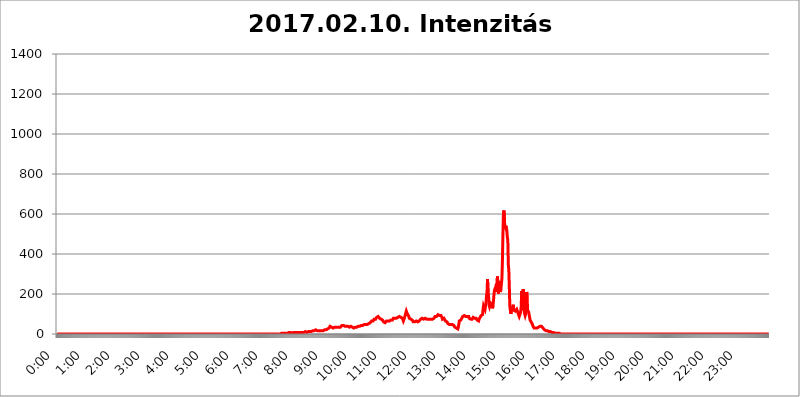
| Category | 2017.02.10. Intenzitás [W/m^2] |
|---|---|
| 0.0 | 0 |
| 0.0006944444444444445 | 0 |
| 0.001388888888888889 | 0 |
| 0.0020833333333333333 | 0 |
| 0.002777777777777778 | 0 |
| 0.003472222222222222 | 0 |
| 0.004166666666666667 | 0 |
| 0.004861111111111111 | 0 |
| 0.005555555555555556 | 0 |
| 0.0062499999999999995 | 0 |
| 0.006944444444444444 | 0 |
| 0.007638888888888889 | 0 |
| 0.008333333333333333 | 0 |
| 0.009027777777777779 | 0 |
| 0.009722222222222222 | 0 |
| 0.010416666666666666 | 0 |
| 0.011111111111111112 | 0 |
| 0.011805555555555555 | 0 |
| 0.012499999999999999 | 0 |
| 0.013194444444444444 | 0 |
| 0.013888888888888888 | 0 |
| 0.014583333333333332 | 0 |
| 0.015277777777777777 | 0 |
| 0.015972222222222224 | 0 |
| 0.016666666666666666 | 0 |
| 0.017361111111111112 | 0 |
| 0.018055555555555557 | 0 |
| 0.01875 | 0 |
| 0.019444444444444445 | 0 |
| 0.02013888888888889 | 0 |
| 0.020833333333333332 | 0 |
| 0.02152777777777778 | 0 |
| 0.022222222222222223 | 0 |
| 0.02291666666666667 | 0 |
| 0.02361111111111111 | 0 |
| 0.024305555555555556 | 0 |
| 0.024999999999999998 | 0 |
| 0.025694444444444447 | 0 |
| 0.02638888888888889 | 0 |
| 0.027083333333333334 | 0 |
| 0.027777777777777776 | 0 |
| 0.02847222222222222 | 0 |
| 0.029166666666666664 | 0 |
| 0.029861111111111113 | 0 |
| 0.030555555555555555 | 0 |
| 0.03125 | 0 |
| 0.03194444444444445 | 0 |
| 0.03263888888888889 | 0 |
| 0.03333333333333333 | 0 |
| 0.034027777777777775 | 0 |
| 0.034722222222222224 | 0 |
| 0.035416666666666666 | 0 |
| 0.036111111111111115 | 0 |
| 0.03680555555555556 | 0 |
| 0.0375 | 0 |
| 0.03819444444444444 | 0 |
| 0.03888888888888889 | 0 |
| 0.03958333333333333 | 0 |
| 0.04027777777777778 | 0 |
| 0.04097222222222222 | 0 |
| 0.041666666666666664 | 0 |
| 0.042361111111111106 | 0 |
| 0.04305555555555556 | 0 |
| 0.043750000000000004 | 0 |
| 0.044444444444444446 | 0 |
| 0.04513888888888889 | 0 |
| 0.04583333333333334 | 0 |
| 0.04652777777777778 | 0 |
| 0.04722222222222222 | 0 |
| 0.04791666666666666 | 0 |
| 0.04861111111111111 | 0 |
| 0.049305555555555554 | 0 |
| 0.049999999999999996 | 0 |
| 0.05069444444444445 | 0 |
| 0.051388888888888894 | 0 |
| 0.052083333333333336 | 0 |
| 0.05277777777777778 | 0 |
| 0.05347222222222222 | 0 |
| 0.05416666666666667 | 0 |
| 0.05486111111111111 | 0 |
| 0.05555555555555555 | 0 |
| 0.05625 | 0 |
| 0.05694444444444444 | 0 |
| 0.057638888888888885 | 0 |
| 0.05833333333333333 | 0 |
| 0.05902777777777778 | 0 |
| 0.059722222222222225 | 0 |
| 0.06041666666666667 | 0 |
| 0.061111111111111116 | 0 |
| 0.06180555555555556 | 0 |
| 0.0625 | 0 |
| 0.06319444444444444 | 0 |
| 0.06388888888888888 | 0 |
| 0.06458333333333334 | 0 |
| 0.06527777777777778 | 0 |
| 0.06597222222222222 | 0 |
| 0.06666666666666667 | 0 |
| 0.06736111111111111 | 0 |
| 0.06805555555555555 | 0 |
| 0.06874999999999999 | 0 |
| 0.06944444444444443 | 0 |
| 0.07013888888888889 | 0 |
| 0.07083333333333333 | 0 |
| 0.07152777777777779 | 0 |
| 0.07222222222222223 | 0 |
| 0.07291666666666667 | 0 |
| 0.07361111111111111 | 0 |
| 0.07430555555555556 | 0 |
| 0.075 | 0 |
| 0.07569444444444444 | 0 |
| 0.0763888888888889 | 0 |
| 0.07708333333333334 | 0 |
| 0.07777777777777778 | 0 |
| 0.07847222222222222 | 0 |
| 0.07916666666666666 | 0 |
| 0.0798611111111111 | 0 |
| 0.08055555555555556 | 0 |
| 0.08125 | 0 |
| 0.08194444444444444 | 0 |
| 0.08263888888888889 | 0 |
| 0.08333333333333333 | 0 |
| 0.08402777777777777 | 0 |
| 0.08472222222222221 | 0 |
| 0.08541666666666665 | 0 |
| 0.08611111111111112 | 0 |
| 0.08680555555555557 | 0 |
| 0.08750000000000001 | 0 |
| 0.08819444444444445 | 0 |
| 0.08888888888888889 | 0 |
| 0.08958333333333333 | 0 |
| 0.09027777777777778 | 0 |
| 0.09097222222222222 | 0 |
| 0.09166666666666667 | 0 |
| 0.09236111111111112 | 0 |
| 0.09305555555555556 | 0 |
| 0.09375 | 0 |
| 0.09444444444444444 | 0 |
| 0.09513888888888888 | 0 |
| 0.09583333333333333 | 0 |
| 0.09652777777777777 | 0 |
| 0.09722222222222222 | 0 |
| 0.09791666666666667 | 0 |
| 0.09861111111111111 | 0 |
| 0.09930555555555555 | 0 |
| 0.09999999999999999 | 0 |
| 0.10069444444444443 | 0 |
| 0.1013888888888889 | 0 |
| 0.10208333333333335 | 0 |
| 0.10277777777777779 | 0 |
| 0.10347222222222223 | 0 |
| 0.10416666666666667 | 0 |
| 0.10486111111111111 | 0 |
| 0.10555555555555556 | 0 |
| 0.10625 | 0 |
| 0.10694444444444444 | 0 |
| 0.1076388888888889 | 0 |
| 0.10833333333333334 | 0 |
| 0.10902777777777778 | 0 |
| 0.10972222222222222 | 0 |
| 0.1111111111111111 | 0 |
| 0.11180555555555556 | 0 |
| 0.11180555555555556 | 0 |
| 0.1125 | 0 |
| 0.11319444444444444 | 0 |
| 0.11388888888888889 | 0 |
| 0.11458333333333333 | 0 |
| 0.11527777777777777 | 0 |
| 0.11597222222222221 | 0 |
| 0.11666666666666665 | 0 |
| 0.1173611111111111 | 0 |
| 0.11805555555555557 | 0 |
| 0.11944444444444445 | 0 |
| 0.12013888888888889 | 0 |
| 0.12083333333333333 | 0 |
| 0.12152777777777778 | 0 |
| 0.12222222222222223 | 0 |
| 0.12291666666666667 | 0 |
| 0.12291666666666667 | 0 |
| 0.12361111111111112 | 0 |
| 0.12430555555555556 | 0 |
| 0.125 | 0 |
| 0.12569444444444444 | 0 |
| 0.12638888888888888 | 0 |
| 0.12708333333333333 | 0 |
| 0.16875 | 0 |
| 0.12847222222222224 | 0 |
| 0.12916666666666668 | 0 |
| 0.12986111111111112 | 0 |
| 0.13055555555555556 | 0 |
| 0.13125 | 0 |
| 0.13194444444444445 | 0 |
| 0.1326388888888889 | 0 |
| 0.13333333333333333 | 0 |
| 0.13402777777777777 | 0 |
| 0.13402777777777777 | 0 |
| 0.13472222222222222 | 0 |
| 0.13541666666666666 | 0 |
| 0.1361111111111111 | 0 |
| 0.13749999999999998 | 0 |
| 0.13819444444444443 | 0 |
| 0.1388888888888889 | 0 |
| 0.13958333333333334 | 0 |
| 0.14027777777777778 | 0 |
| 0.14097222222222222 | 0 |
| 0.14166666666666666 | 0 |
| 0.1423611111111111 | 0 |
| 0.14305555555555557 | 0 |
| 0.14375000000000002 | 0 |
| 0.14444444444444446 | 0 |
| 0.1451388888888889 | 0 |
| 0.1451388888888889 | 0 |
| 0.14652777777777778 | 0 |
| 0.14722222222222223 | 0 |
| 0.14791666666666667 | 0 |
| 0.1486111111111111 | 0 |
| 0.14930555555555555 | 0 |
| 0.15 | 0 |
| 0.15069444444444444 | 0 |
| 0.15138888888888888 | 0 |
| 0.15208333333333332 | 0 |
| 0.15277777777777776 | 0 |
| 0.15347222222222223 | 0 |
| 0.15416666666666667 | 0 |
| 0.15486111111111112 | 0 |
| 0.15555555555555556 | 0 |
| 0.15625 | 0 |
| 0.15694444444444444 | 0 |
| 0.15763888888888888 | 0 |
| 0.15833333333333333 | 0 |
| 0.15902777777777777 | 0 |
| 0.15972222222222224 | 0 |
| 0.16041666666666668 | 0 |
| 0.16111111111111112 | 0 |
| 0.16180555555555556 | 0 |
| 0.1625 | 0 |
| 0.16319444444444445 | 0 |
| 0.1638888888888889 | 0 |
| 0.16458333333333333 | 0 |
| 0.16527777777777777 | 0 |
| 0.16597222222222222 | 0 |
| 0.16666666666666666 | 0 |
| 0.1673611111111111 | 0 |
| 0.16805555555555554 | 0 |
| 0.16874999999999998 | 0 |
| 0.16944444444444443 | 0 |
| 0.17013888888888887 | 0 |
| 0.1708333333333333 | 0 |
| 0.17152777777777775 | 0 |
| 0.17222222222222225 | 0 |
| 0.1729166666666667 | 0 |
| 0.17361111111111113 | 0 |
| 0.17430555555555557 | 0 |
| 0.17500000000000002 | 0 |
| 0.17569444444444446 | 0 |
| 0.1763888888888889 | 0 |
| 0.17708333333333334 | 0 |
| 0.17777777777777778 | 0 |
| 0.17847222222222223 | 0 |
| 0.17916666666666667 | 0 |
| 0.1798611111111111 | 0 |
| 0.18055555555555555 | 0 |
| 0.18125 | 0 |
| 0.18194444444444444 | 0 |
| 0.1826388888888889 | 0 |
| 0.18333333333333335 | 0 |
| 0.1840277777777778 | 0 |
| 0.18472222222222223 | 0 |
| 0.18541666666666667 | 0 |
| 0.18611111111111112 | 0 |
| 0.18680555555555556 | 0 |
| 0.1875 | 0 |
| 0.18819444444444444 | 0 |
| 0.18888888888888888 | 0 |
| 0.18958333333333333 | 0 |
| 0.19027777777777777 | 0 |
| 0.1909722222222222 | 0 |
| 0.19166666666666665 | 0 |
| 0.19236111111111112 | 0 |
| 0.19305555555555554 | 0 |
| 0.19375 | 0 |
| 0.19444444444444445 | 0 |
| 0.1951388888888889 | 0 |
| 0.19583333333333333 | 0 |
| 0.19652777777777777 | 0 |
| 0.19722222222222222 | 0 |
| 0.19791666666666666 | 0 |
| 0.1986111111111111 | 0 |
| 0.19930555555555554 | 0 |
| 0.19999999999999998 | 0 |
| 0.20069444444444443 | 0 |
| 0.20138888888888887 | 0 |
| 0.2020833333333333 | 0 |
| 0.2027777777777778 | 0 |
| 0.2034722222222222 | 0 |
| 0.2041666666666667 | 0 |
| 0.20486111111111113 | 0 |
| 0.20555555555555557 | 0 |
| 0.20625000000000002 | 0 |
| 0.20694444444444446 | 0 |
| 0.2076388888888889 | 0 |
| 0.20833333333333334 | 0 |
| 0.20902777777777778 | 0 |
| 0.20972222222222223 | 0 |
| 0.21041666666666667 | 0 |
| 0.2111111111111111 | 0 |
| 0.21180555555555555 | 0 |
| 0.2125 | 0 |
| 0.21319444444444444 | 0 |
| 0.2138888888888889 | 0 |
| 0.21458333333333335 | 0 |
| 0.2152777777777778 | 0 |
| 0.21597222222222223 | 0 |
| 0.21666666666666667 | 0 |
| 0.21736111111111112 | 0 |
| 0.21805555555555556 | 0 |
| 0.21875 | 0 |
| 0.21944444444444444 | 0 |
| 0.22013888888888888 | 0 |
| 0.22083333333333333 | 0 |
| 0.22152777777777777 | 0 |
| 0.2222222222222222 | 0 |
| 0.22291666666666665 | 0 |
| 0.2236111111111111 | 0 |
| 0.22430555555555556 | 0 |
| 0.225 | 0 |
| 0.22569444444444445 | 0 |
| 0.2263888888888889 | 0 |
| 0.22708333333333333 | 0 |
| 0.22777777777777777 | 0 |
| 0.22847222222222222 | 0 |
| 0.22916666666666666 | 0 |
| 0.2298611111111111 | 0 |
| 0.23055555555555554 | 0 |
| 0.23124999999999998 | 0 |
| 0.23194444444444443 | 0 |
| 0.23263888888888887 | 0 |
| 0.2333333333333333 | 0 |
| 0.2340277777777778 | 0 |
| 0.2347222222222222 | 0 |
| 0.2354166666666667 | 0 |
| 0.23611111111111113 | 0 |
| 0.23680555555555557 | 0 |
| 0.23750000000000002 | 0 |
| 0.23819444444444446 | 0 |
| 0.2388888888888889 | 0 |
| 0.23958333333333334 | 0 |
| 0.24027777777777778 | 0 |
| 0.24097222222222223 | 0 |
| 0.24166666666666667 | 0 |
| 0.2423611111111111 | 0 |
| 0.24305555555555555 | 0 |
| 0.24375 | 0 |
| 0.24444444444444446 | 0 |
| 0.24513888888888888 | 0 |
| 0.24583333333333335 | 0 |
| 0.2465277777777778 | 0 |
| 0.24722222222222223 | 0 |
| 0.24791666666666667 | 0 |
| 0.24861111111111112 | 0 |
| 0.24930555555555556 | 0 |
| 0.25 | 0 |
| 0.25069444444444444 | 0 |
| 0.2513888888888889 | 0 |
| 0.2520833333333333 | 0 |
| 0.25277777777777777 | 0 |
| 0.2534722222222222 | 0 |
| 0.25416666666666665 | 0 |
| 0.2548611111111111 | 0 |
| 0.2555555555555556 | 0 |
| 0.25625000000000003 | 0 |
| 0.2569444444444445 | 0 |
| 0.2576388888888889 | 0 |
| 0.25833333333333336 | 0 |
| 0.2590277777777778 | 0 |
| 0.25972222222222224 | 0 |
| 0.2604166666666667 | 0 |
| 0.2611111111111111 | 0 |
| 0.26180555555555557 | 0 |
| 0.2625 | 0 |
| 0.26319444444444445 | 0 |
| 0.2638888888888889 | 0 |
| 0.26458333333333334 | 0 |
| 0.2652777777777778 | 0 |
| 0.2659722222222222 | 0 |
| 0.26666666666666666 | 0 |
| 0.2673611111111111 | 0 |
| 0.26805555555555555 | 0 |
| 0.26875 | 0 |
| 0.26944444444444443 | 0 |
| 0.2701388888888889 | 0 |
| 0.2708333333333333 | 0 |
| 0.27152777777777776 | 0 |
| 0.2722222222222222 | 0 |
| 0.27291666666666664 | 0 |
| 0.2736111111111111 | 0 |
| 0.2743055555555555 | 0 |
| 0.27499999999999997 | 0 |
| 0.27569444444444446 | 0 |
| 0.27638888888888885 | 0 |
| 0.27708333333333335 | 0 |
| 0.2777777777777778 | 0 |
| 0.27847222222222223 | 0 |
| 0.2791666666666667 | 0 |
| 0.2798611111111111 | 0 |
| 0.28055555555555556 | 0 |
| 0.28125 | 0 |
| 0.28194444444444444 | 0 |
| 0.2826388888888889 | 0 |
| 0.2833333333333333 | 0 |
| 0.28402777777777777 | 0 |
| 0.2847222222222222 | 0 |
| 0.28541666666666665 | 0 |
| 0.28611111111111115 | 0 |
| 0.28680555555555554 | 0 |
| 0.28750000000000003 | 0 |
| 0.2881944444444445 | 0 |
| 0.2888888888888889 | 0 |
| 0.28958333333333336 | 0 |
| 0.2902777777777778 | 0 |
| 0.29097222222222224 | 0 |
| 0.2916666666666667 | 0 |
| 0.2923611111111111 | 0 |
| 0.29305555555555557 | 0 |
| 0.29375 | 0 |
| 0.29444444444444445 | 0 |
| 0.2951388888888889 | 0 |
| 0.29583333333333334 | 0 |
| 0.2965277777777778 | 0 |
| 0.2972222222222222 | 0 |
| 0.29791666666666666 | 0 |
| 0.2986111111111111 | 0 |
| 0.29930555555555555 | 0 |
| 0.3 | 0 |
| 0.30069444444444443 | 0 |
| 0.3013888888888889 | 0 |
| 0.3020833333333333 | 0 |
| 0.30277777777777776 | 0 |
| 0.3034722222222222 | 0 |
| 0.30416666666666664 | 0 |
| 0.3048611111111111 | 0 |
| 0.3055555555555555 | 0 |
| 0.30624999999999997 | 0 |
| 0.3069444444444444 | 0 |
| 0.3076388888888889 | 0 |
| 0.30833333333333335 | 0 |
| 0.3090277777777778 | 0 |
| 0.30972222222222223 | 3.525 |
| 0.3104166666666667 | 0 |
| 0.3111111111111111 | 0 |
| 0.31180555555555556 | 0 |
| 0.3125 | 0 |
| 0.31319444444444444 | 3.525 |
| 0.3138888888888889 | 3.525 |
| 0.3145833333333333 | 3.525 |
| 0.31527777777777777 | 3.525 |
| 0.3159722222222222 | 3.525 |
| 0.31666666666666665 | 3.525 |
| 0.31736111111111115 | 3.525 |
| 0.31805555555555554 | 3.525 |
| 0.31875000000000003 | 3.525 |
| 0.3194444444444445 | 3.525 |
| 0.3201388888888889 | 3.525 |
| 0.32083333333333336 | 3.525 |
| 0.3215277777777778 | 3.525 |
| 0.32222222222222224 | 3.525 |
| 0.3229166666666667 | 3.525 |
| 0.3236111111111111 | 3.525 |
| 0.32430555555555557 | 3.525 |
| 0.325 | 7.887 |
| 0.32569444444444445 | 7.887 |
| 0.3263888888888889 | 7.887 |
| 0.32708333333333334 | 7.887 |
| 0.3277777777777778 | 7.887 |
| 0.3284722222222222 | 7.887 |
| 0.32916666666666666 | 3.525 |
| 0.3298611111111111 | 7.887 |
| 0.33055555555555555 | 7.887 |
| 0.33125 | 7.887 |
| 0.33194444444444443 | 7.887 |
| 0.3326388888888889 | 7.887 |
| 0.3333333333333333 | 7.887 |
| 0.3340277777777778 | 7.887 |
| 0.3347222222222222 | 7.887 |
| 0.3354166666666667 | 7.887 |
| 0.3361111111111111 | 7.887 |
| 0.3368055555555556 | 7.887 |
| 0.33749999999999997 | 7.887 |
| 0.33819444444444446 | 7.887 |
| 0.33888888888888885 | 7.887 |
| 0.33958333333333335 | 7.887 |
| 0.34027777777777773 | 7.887 |
| 0.34097222222222223 | 7.887 |
| 0.3416666666666666 | 7.887 |
| 0.3423611111111111 | 7.887 |
| 0.3430555555555555 | 7.887 |
| 0.34375 | 7.887 |
| 0.3444444444444445 | 7.887 |
| 0.3451388888888889 | 7.887 |
| 0.3458333333333334 | 7.887 |
| 0.34652777777777777 | 7.887 |
| 0.34722222222222227 | 7.887 |
| 0.34791666666666665 | 12.257 |
| 0.34861111111111115 | 7.887 |
| 0.34930555555555554 | 7.887 |
| 0.35000000000000003 | 7.887 |
| 0.3506944444444444 | 12.257 |
| 0.3513888888888889 | 12.257 |
| 0.3520833333333333 | 12.257 |
| 0.3527777777777778 | 12.257 |
| 0.3534722222222222 | 12.257 |
| 0.3541666666666667 | 12.257 |
| 0.3548611111111111 | 12.257 |
| 0.35555555555555557 | 12.257 |
| 0.35625 | 12.257 |
| 0.35694444444444445 | 12.257 |
| 0.3576388888888889 | 16.636 |
| 0.35833333333333334 | 16.636 |
| 0.3590277777777778 | 16.636 |
| 0.3597222222222222 | 12.257 |
| 0.36041666666666666 | 16.636 |
| 0.3611111111111111 | 16.636 |
| 0.36180555555555555 | 16.636 |
| 0.3625 | 21.024 |
| 0.36319444444444443 | 21.024 |
| 0.3638888888888889 | 16.636 |
| 0.3645833333333333 | 16.636 |
| 0.3652777777777778 | 16.636 |
| 0.3659722222222222 | 16.636 |
| 0.3666666666666667 | 16.636 |
| 0.3673611111111111 | 16.636 |
| 0.3680555555555556 | 16.636 |
| 0.36874999999999997 | 16.636 |
| 0.36944444444444446 | 16.636 |
| 0.37013888888888885 | 16.636 |
| 0.37083333333333335 | 16.636 |
| 0.37152777777777773 | 16.636 |
| 0.37222222222222223 | 16.636 |
| 0.3729166666666666 | 16.636 |
| 0.3736111111111111 | 21.024 |
| 0.3743055555555555 | 16.636 |
| 0.375 | 21.024 |
| 0.3756944444444445 | 21.024 |
| 0.3763888888888889 | 21.024 |
| 0.3770833333333334 | 21.024 |
| 0.37777777777777777 | 21.024 |
| 0.37847222222222227 | 25.419 |
| 0.37916666666666665 | 25.419 |
| 0.37986111111111115 | 25.419 |
| 0.38055555555555554 | 29.823 |
| 0.38125000000000003 | 29.823 |
| 0.3819444444444444 | 34.234 |
| 0.3826388888888889 | 38.653 |
| 0.3833333333333333 | 38.653 |
| 0.3840277777777778 | 38.653 |
| 0.3847222222222222 | 34.234 |
| 0.3854166666666667 | 34.234 |
| 0.3861111111111111 | 34.234 |
| 0.38680555555555557 | 29.823 |
| 0.3875 | 29.823 |
| 0.38819444444444445 | 34.234 |
| 0.3888888888888889 | 34.234 |
| 0.38958333333333334 | 34.234 |
| 0.3902777777777778 | 29.823 |
| 0.3909722222222222 | 34.234 |
| 0.39166666666666666 | 38.653 |
| 0.3923611111111111 | 38.653 |
| 0.39305555555555555 | 34.234 |
| 0.39375 | 29.823 |
| 0.39444444444444443 | 34.234 |
| 0.3951388888888889 | 34.234 |
| 0.3958333333333333 | 34.234 |
| 0.3965277777777778 | 34.234 |
| 0.3972222222222222 | 34.234 |
| 0.3979166666666667 | 34.234 |
| 0.3986111111111111 | 38.653 |
| 0.3993055555555556 | 43.079 |
| 0.39999999999999997 | 43.079 |
| 0.40069444444444446 | 43.079 |
| 0.40138888888888885 | 43.079 |
| 0.40208333333333335 | 43.079 |
| 0.40277777777777773 | 38.653 |
| 0.40347222222222223 | 38.653 |
| 0.4041666666666666 | 38.653 |
| 0.4048611111111111 | 38.653 |
| 0.4055555555555555 | 38.653 |
| 0.40625 | 38.653 |
| 0.4069444444444445 | 38.653 |
| 0.4076388888888889 | 38.653 |
| 0.4083333333333334 | 38.653 |
| 0.40902777777777777 | 34.234 |
| 0.40972222222222227 | 34.234 |
| 0.41041666666666665 | 38.653 |
| 0.41111111111111115 | 38.653 |
| 0.41180555555555554 | 38.653 |
| 0.41250000000000003 | 38.653 |
| 0.4131944444444444 | 38.653 |
| 0.4138888888888889 | 34.234 |
| 0.4145833333333333 | 29.823 |
| 0.4152777777777778 | 29.823 |
| 0.4159722222222222 | 29.823 |
| 0.4166666666666667 | 34.234 |
| 0.4173611111111111 | 34.234 |
| 0.41805555555555557 | 34.234 |
| 0.41875 | 38.653 |
| 0.41944444444444445 | 34.234 |
| 0.4201388888888889 | 34.234 |
| 0.42083333333333334 | 34.234 |
| 0.4215277777777778 | 34.234 |
| 0.4222222222222222 | 38.653 |
| 0.42291666666666666 | 38.653 |
| 0.4236111111111111 | 38.653 |
| 0.42430555555555555 | 38.653 |
| 0.425 | 38.653 |
| 0.42569444444444443 | 43.079 |
| 0.4263888888888889 | 43.079 |
| 0.4270833333333333 | 38.653 |
| 0.4277777777777778 | 38.653 |
| 0.4284722222222222 | 43.079 |
| 0.4291666666666667 | 47.511 |
| 0.4298611111111111 | 47.511 |
| 0.4305555555555556 | 47.511 |
| 0.43124999999999997 | 47.511 |
| 0.43194444444444446 | 47.511 |
| 0.43263888888888885 | 47.511 |
| 0.43333333333333335 | 47.511 |
| 0.43402777777777773 | 47.511 |
| 0.43472222222222223 | 47.511 |
| 0.4354166666666666 | 47.511 |
| 0.4361111111111111 | 51.951 |
| 0.4368055555555555 | 51.951 |
| 0.4375 | 56.398 |
| 0.4381944444444445 | 56.398 |
| 0.4388888888888889 | 56.398 |
| 0.4395833333333334 | 56.398 |
| 0.44027777777777777 | 60.85 |
| 0.44097222222222227 | 65.31 |
| 0.44166666666666665 | 69.775 |
| 0.44236111111111115 | 65.31 |
| 0.44305555555555554 | 65.31 |
| 0.44375000000000003 | 69.775 |
| 0.4444444444444444 | 74.246 |
| 0.4451388888888889 | 74.246 |
| 0.4458333333333333 | 74.246 |
| 0.4465277777777778 | 74.246 |
| 0.4472222222222222 | 78.722 |
| 0.4479166666666667 | 83.205 |
| 0.4486111111111111 | 83.205 |
| 0.44930555555555557 | 83.205 |
| 0.45 | 87.692 |
| 0.45069444444444445 | 92.184 |
| 0.4513888888888889 | 87.692 |
| 0.45208333333333334 | 78.722 |
| 0.4527777777777778 | 78.722 |
| 0.4534722222222222 | 78.722 |
| 0.45416666666666666 | 74.246 |
| 0.4548611111111111 | 69.775 |
| 0.45555555555555555 | 69.775 |
| 0.45625 | 69.775 |
| 0.45694444444444443 | 65.31 |
| 0.4576388888888889 | 60.85 |
| 0.4583333333333333 | 56.398 |
| 0.4590277777777778 | 56.398 |
| 0.4597222222222222 | 56.398 |
| 0.4604166666666667 | 60.85 |
| 0.4611111111111111 | 60.85 |
| 0.4618055555555556 | 65.31 |
| 0.46249999999999997 | 65.31 |
| 0.46319444444444446 | 65.31 |
| 0.46388888888888885 | 65.31 |
| 0.46458333333333335 | 60.85 |
| 0.46527777777777773 | 65.31 |
| 0.46597222222222223 | 65.31 |
| 0.4666666666666666 | 69.775 |
| 0.4673611111111111 | 69.775 |
| 0.4680555555555555 | 69.775 |
| 0.46875 | 69.775 |
| 0.4694444444444445 | 65.31 |
| 0.4701388888888889 | 69.775 |
| 0.4708333333333334 | 74.246 |
| 0.47152777777777777 | 78.722 |
| 0.47222222222222227 | 78.722 |
| 0.47291666666666665 | 78.722 |
| 0.47361111111111115 | 78.722 |
| 0.47430555555555554 | 74.246 |
| 0.47500000000000003 | 78.722 |
| 0.4756944444444444 | 78.722 |
| 0.4763888888888889 | 83.205 |
| 0.4770833333333333 | 83.205 |
| 0.4777777777777778 | 83.205 |
| 0.4784722222222222 | 83.205 |
| 0.4791666666666667 | 83.205 |
| 0.4798611111111111 | 87.692 |
| 0.48055555555555557 | 92.184 |
| 0.48125 | 87.692 |
| 0.48194444444444445 | 83.205 |
| 0.4826388888888889 | 83.205 |
| 0.48333333333333334 | 87.692 |
| 0.4840277777777778 | 78.722 |
| 0.4847222222222222 | 74.246 |
| 0.48541666666666666 | 65.31 |
| 0.4861111111111111 | 69.775 |
| 0.48680555555555555 | 78.722 |
| 0.4875 | 87.692 |
| 0.48819444444444443 | 96.682 |
| 0.4888888888888889 | 101.184 |
| 0.4895833333333333 | 114.716 |
| 0.4902777777777778 | 110.201 |
| 0.4909722222222222 | 101.184 |
| 0.4916666666666667 | 105.69 |
| 0.4923611111111111 | 101.184 |
| 0.4930555555555556 | 87.692 |
| 0.49374999999999997 | 78.722 |
| 0.49444444444444446 | 78.722 |
| 0.49513888888888885 | 74.246 |
| 0.49583333333333335 | 74.246 |
| 0.49652777777777773 | 74.246 |
| 0.49722222222222223 | 69.775 |
| 0.4979166666666666 | 69.775 |
| 0.4986111111111111 | 65.31 |
| 0.4993055555555555 | 60.85 |
| 0.5 | 60.85 |
| 0.5006944444444444 | 60.85 |
| 0.5013888888888889 | 60.85 |
| 0.5020833333333333 | 60.85 |
| 0.5027777777777778 | 60.85 |
| 0.5034722222222222 | 65.31 |
| 0.5041666666666667 | 65.31 |
| 0.5048611111111111 | 60.85 |
| 0.5055555555555555 | 60.85 |
| 0.50625 | 60.85 |
| 0.5069444444444444 | 65.31 |
| 0.5076388888888889 | 65.31 |
| 0.5083333333333333 | 69.775 |
| 0.5090277777777777 | 69.775 |
| 0.5097222222222222 | 74.246 |
| 0.5104166666666666 | 74.246 |
| 0.5111111111111112 | 78.722 |
| 0.5118055555555555 | 78.722 |
| 0.5125000000000001 | 78.722 |
| 0.5131944444444444 | 74.246 |
| 0.513888888888889 | 74.246 |
| 0.5145833333333333 | 74.246 |
| 0.5152777777777778 | 74.246 |
| 0.5159722222222222 | 78.722 |
| 0.5166666666666667 | 78.722 |
| 0.517361111111111 | 74.246 |
| 0.5180555555555556 | 74.246 |
| 0.5187499999999999 | 74.246 |
| 0.5194444444444445 | 74.246 |
| 0.5201388888888888 | 74.246 |
| 0.5208333333333334 | 69.775 |
| 0.5215277777777778 | 69.775 |
| 0.5222222222222223 | 74.246 |
| 0.5229166666666667 | 78.722 |
| 0.5236111111111111 | 74.246 |
| 0.5243055555555556 | 74.246 |
| 0.525 | 74.246 |
| 0.5256944444444445 | 74.246 |
| 0.5263888888888889 | 74.246 |
| 0.5270833333333333 | 74.246 |
| 0.5277777777777778 | 74.246 |
| 0.5284722222222222 | 78.722 |
| 0.5291666666666667 | 78.722 |
| 0.5298611111111111 | 87.692 |
| 0.5305555555555556 | 87.692 |
| 0.53125 | 83.205 |
| 0.5319444444444444 | 87.692 |
| 0.5326388888888889 | 92.184 |
| 0.5333333333333333 | 92.184 |
| 0.5340277777777778 | 96.682 |
| 0.5347222222222222 | 96.682 |
| 0.5354166666666667 | 92.184 |
| 0.5361111111111111 | 92.184 |
| 0.5368055555555555 | 96.682 |
| 0.5375 | 96.682 |
| 0.5381944444444444 | 92.184 |
| 0.5388888888888889 | 87.692 |
| 0.5395833333333333 | 83.205 |
| 0.5402777777777777 | 74.246 |
| 0.5409722222222222 | 78.722 |
| 0.5416666666666666 | 74.246 |
| 0.5423611111111112 | 78.722 |
| 0.5430555555555555 | 78.722 |
| 0.5437500000000001 | 74.246 |
| 0.5444444444444444 | 65.31 |
| 0.545138888888889 | 60.85 |
| 0.5458333333333333 | 60.85 |
| 0.5465277777777778 | 60.85 |
| 0.5472222222222222 | 56.398 |
| 0.5479166666666667 | 51.951 |
| 0.548611111111111 | 51.951 |
| 0.5493055555555556 | 47.511 |
| 0.5499999999999999 | 47.511 |
| 0.5506944444444445 | 47.511 |
| 0.5513888888888888 | 47.511 |
| 0.5520833333333334 | 47.511 |
| 0.5527777777777778 | 47.511 |
| 0.5534722222222223 | 47.511 |
| 0.5541666666666667 | 47.511 |
| 0.5548611111111111 | 47.511 |
| 0.5555555555555556 | 43.079 |
| 0.55625 | 43.079 |
| 0.5569444444444445 | 38.653 |
| 0.5576388888888889 | 34.234 |
| 0.5583333333333333 | 34.234 |
| 0.5590277777777778 | 34.234 |
| 0.5597222222222222 | 29.823 |
| 0.5604166666666667 | 25.419 |
| 0.5611111111111111 | 25.419 |
| 0.5618055555555556 | 25.419 |
| 0.5625 | 34.234 |
| 0.5631944444444444 | 47.511 |
| 0.5638888888888889 | 65.31 |
| 0.5645833333333333 | 65.31 |
| 0.5652777777777778 | 69.775 |
| 0.5659722222222222 | 69.775 |
| 0.5666666666666667 | 74.246 |
| 0.5673611111111111 | 78.722 |
| 0.5680555555555555 | 83.205 |
| 0.56875 | 87.692 |
| 0.5694444444444444 | 87.692 |
| 0.5701388888888889 | 92.184 |
| 0.5708333333333333 | 92.184 |
| 0.5715277777777777 | 87.692 |
| 0.5722222222222222 | 87.692 |
| 0.5729166666666666 | 87.692 |
| 0.5736111111111112 | 87.692 |
| 0.5743055555555555 | 87.692 |
| 0.5750000000000001 | 87.692 |
| 0.5756944444444444 | 92.184 |
| 0.576388888888889 | 92.184 |
| 0.5770833333333333 | 87.692 |
| 0.5777777777777778 | 78.722 |
| 0.5784722222222222 | 74.246 |
| 0.5791666666666667 | 74.246 |
| 0.579861111111111 | 74.246 |
| 0.5805555555555556 | 69.775 |
| 0.5812499999999999 | 74.246 |
| 0.5819444444444445 | 74.246 |
| 0.5826388888888888 | 78.722 |
| 0.5833333333333334 | 83.205 |
| 0.5840277777777778 | 83.205 |
| 0.5847222222222223 | 78.722 |
| 0.5854166666666667 | 78.722 |
| 0.5861111111111111 | 83.205 |
| 0.5868055555555556 | 83.205 |
| 0.5875 | 78.722 |
| 0.5881944444444445 | 78.722 |
| 0.5888888888888889 | 69.775 |
| 0.5895833333333333 | 65.31 |
| 0.5902777777777778 | 65.31 |
| 0.5909722222222222 | 65.31 |
| 0.5916666666666667 | 74.246 |
| 0.5923611111111111 | 78.722 |
| 0.5930555555555556 | 83.205 |
| 0.59375 | 87.692 |
| 0.5944444444444444 | 92.184 |
| 0.5951388888888889 | 92.184 |
| 0.5958333333333333 | 87.692 |
| 0.5965277777777778 | 96.682 |
| 0.5972222222222222 | 123.758 |
| 0.5979166666666667 | 141.884 |
| 0.5986111111111111 | 141.884 |
| 0.5993055555555555 | 137.347 |
| 0.6 | 123.758 |
| 0.6006944444444444 | 123.758 |
| 0.6013888888888889 | 155.509 |
| 0.6020833333333333 | 191.937 |
| 0.6027777777777777 | 205.62 |
| 0.6034722222222222 | 274.047 |
| 0.6041666666666666 | 210.182 |
| 0.6048611111111112 | 196.497 |
| 0.6055555555555555 | 146.423 |
| 0.6062500000000001 | 137.347 |
| 0.6069444444444444 | 146.423 |
| 0.607638888888889 | 155.509 |
| 0.6083333333333333 | 155.509 |
| 0.6090277777777778 | 150.964 |
| 0.6097222222222222 | 146.423 |
| 0.6104166666666667 | 128.284 |
| 0.611111111111111 | 141.884 |
| 0.6118055555555556 | 164.605 |
| 0.6124999999999999 | 196.497 |
| 0.6131944444444445 | 219.309 |
| 0.6138888888888888 | 223.873 |
| 0.6145833333333334 | 214.746 |
| 0.6152777777777778 | 237.564 |
| 0.6159722222222223 | 251.251 |
| 0.6166666666666667 | 210.182 |
| 0.6173611111111111 | 287.709 |
| 0.6180555555555556 | 251.251 |
| 0.61875 | 201.058 |
| 0.6194444444444445 | 264.932 |
| 0.6201388888888889 | 237.564 |
| 0.6208333333333333 | 219.309 |
| 0.6215277777777778 | 210.182 |
| 0.6222222222222222 | 223.873 |
| 0.6229166666666667 | 251.251 |
| 0.6236111111111111 | 274.047 |
| 0.6243055555555556 | 355.712 |
| 0.625 | 484.735 |
| 0.6256944444444444 | 592.233 |
| 0.6263888888888889 | 617.436 |
| 0.6270833333333333 | 588.009 |
| 0.6277777777777778 | 523.88 |
| 0.6284722222222222 | 528.2 |
| 0.6291666666666667 | 541.121 |
| 0.6298611111111111 | 545.416 |
| 0.6305555555555555 | 515.223 |
| 0.63125 | 484.735 |
| 0.6319444444444444 | 467.187 |
| 0.6326388888888889 | 346.682 |
| 0.6333333333333333 | 319.517 |
| 0.6340277777777777 | 237.564 |
| 0.6347222222222222 | 141.884 |
| 0.6354166666666666 | 119.235 |
| 0.6361111111111112 | 101.184 |
| 0.6368055555555555 | 110.201 |
| 0.6375000000000001 | 114.716 |
| 0.6381944444444444 | 128.284 |
| 0.638888888888889 | 132.814 |
| 0.6395833333333333 | 146.423 |
| 0.6402777777777778 | 119.235 |
| 0.6409722222222222 | 119.235 |
| 0.6416666666666667 | 119.235 |
| 0.642361111111111 | 114.716 |
| 0.6430555555555556 | 119.235 |
| 0.6437499999999999 | 119.235 |
| 0.6444444444444445 | 123.758 |
| 0.6451388888888888 | 119.235 |
| 0.6458333333333334 | 110.201 |
| 0.6465277777777778 | 101.184 |
| 0.6472222222222223 | 96.682 |
| 0.6479166666666667 | 87.692 |
| 0.6486111111111111 | 83.205 |
| 0.6493055555555556 | 92.184 |
| 0.65 | 110.201 |
| 0.6506944444444445 | 137.347 |
| 0.6513888888888889 | 214.746 |
| 0.6520833333333333 | 155.509 |
| 0.6527777777777778 | 119.235 |
| 0.6534722222222222 | 223.873 |
| 0.6541666666666667 | 155.509 |
| 0.6548611111111111 | 169.156 |
| 0.6555555555555556 | 101.184 |
| 0.65625 | 92.184 |
| 0.6569444444444444 | 101.184 |
| 0.6576388888888889 | 110.201 |
| 0.6583333333333333 | 210.182 |
| 0.6590277777777778 | 182.82 |
| 0.6597222222222222 | 119.235 |
| 0.6604166666666667 | 119.235 |
| 0.6611111111111111 | 110.201 |
| 0.6618055555555555 | 96.682 |
| 0.6625 | 92.184 |
| 0.6631944444444444 | 69.775 |
| 0.6638888888888889 | 65.31 |
| 0.6645833333333333 | 60.85 |
| 0.6652777777777777 | 56.398 |
| 0.6659722222222222 | 51.951 |
| 0.6666666666666666 | 47.511 |
| 0.6673611111111111 | 38.653 |
| 0.6680555555555556 | 34.234 |
| 0.6687500000000001 | 29.823 |
| 0.6694444444444444 | 29.823 |
| 0.6701388888888888 | 29.823 |
| 0.6708333333333334 | 29.823 |
| 0.6715277777777778 | 29.823 |
| 0.6722222222222222 | 25.419 |
| 0.6729166666666666 | 29.823 |
| 0.6736111111111112 | 29.823 |
| 0.6743055555555556 | 29.823 |
| 0.6749999999999999 | 34.234 |
| 0.6756944444444444 | 29.823 |
| 0.6763888888888889 | 34.234 |
| 0.6770833333333334 | 38.653 |
| 0.6777777777777777 | 38.653 |
| 0.6784722222222223 | 38.653 |
| 0.6791666666666667 | 38.653 |
| 0.6798611111111111 | 34.234 |
| 0.6805555555555555 | 34.234 |
| 0.68125 | 29.823 |
| 0.6819444444444445 | 29.823 |
| 0.6826388888888889 | 25.419 |
| 0.6833333333333332 | 21.024 |
| 0.6840277777777778 | 21.024 |
| 0.6847222222222222 | 21.024 |
| 0.6854166666666667 | 16.636 |
| 0.686111111111111 | 16.636 |
| 0.6868055555555556 | 16.636 |
| 0.6875 | 16.636 |
| 0.6881944444444444 | 12.257 |
| 0.688888888888889 | 12.257 |
| 0.6895833333333333 | 12.257 |
| 0.6902777777777778 | 12.257 |
| 0.6909722222222222 | 12.257 |
| 0.6916666666666668 | 12.257 |
| 0.6923611111111111 | 12.257 |
| 0.6930555555555555 | 12.257 |
| 0.69375 | 7.887 |
| 0.6944444444444445 | 7.887 |
| 0.6951388888888889 | 7.887 |
| 0.6958333333333333 | 7.887 |
| 0.6965277777777777 | 3.525 |
| 0.6972222222222223 | 3.525 |
| 0.6979166666666666 | 3.525 |
| 0.6986111111111111 | 3.525 |
| 0.6993055555555556 | 3.525 |
| 0.7000000000000001 | 3.525 |
| 0.7006944444444444 | 3.525 |
| 0.7013888888888888 | 3.525 |
| 0.7020833333333334 | 3.525 |
| 0.7027777777777778 | 3.525 |
| 0.7034722222222222 | 3.525 |
| 0.7041666666666666 | 3.525 |
| 0.7048611111111112 | 0 |
| 0.7055555555555556 | 0 |
| 0.7062499999999999 | 0 |
| 0.7069444444444444 | 0 |
| 0.7076388888888889 | 0 |
| 0.7083333333333334 | 0 |
| 0.7090277777777777 | 0 |
| 0.7097222222222223 | 0 |
| 0.7104166666666667 | 0 |
| 0.7111111111111111 | 0 |
| 0.7118055555555555 | 0 |
| 0.7125 | 0 |
| 0.7131944444444445 | 0 |
| 0.7138888888888889 | 0 |
| 0.7145833333333332 | 0 |
| 0.7152777777777778 | 0 |
| 0.7159722222222222 | 0 |
| 0.7166666666666667 | 0 |
| 0.717361111111111 | 0 |
| 0.7180555555555556 | 0 |
| 0.71875 | 0 |
| 0.7194444444444444 | 0 |
| 0.720138888888889 | 0 |
| 0.7208333333333333 | 0 |
| 0.7215277777777778 | 0 |
| 0.7222222222222222 | 0 |
| 0.7229166666666668 | 0 |
| 0.7236111111111111 | 0 |
| 0.7243055555555555 | 0 |
| 0.725 | 0 |
| 0.7256944444444445 | 0 |
| 0.7263888888888889 | 0 |
| 0.7270833333333333 | 0 |
| 0.7277777777777777 | 0 |
| 0.7284722222222223 | 0 |
| 0.7291666666666666 | 0 |
| 0.7298611111111111 | 0 |
| 0.7305555555555556 | 0 |
| 0.7312500000000001 | 0 |
| 0.7319444444444444 | 0 |
| 0.7326388888888888 | 0 |
| 0.7333333333333334 | 0 |
| 0.7340277777777778 | 0 |
| 0.7347222222222222 | 0 |
| 0.7354166666666666 | 0 |
| 0.7361111111111112 | 0 |
| 0.7368055555555556 | 0 |
| 0.7374999999999999 | 0 |
| 0.7381944444444444 | 0 |
| 0.7388888888888889 | 0 |
| 0.7395833333333334 | 0 |
| 0.7402777777777777 | 0 |
| 0.7409722222222223 | 0 |
| 0.7416666666666667 | 0 |
| 0.7423611111111111 | 0 |
| 0.7430555555555555 | 0 |
| 0.74375 | 0 |
| 0.7444444444444445 | 0 |
| 0.7451388888888889 | 0 |
| 0.7458333333333332 | 0 |
| 0.7465277777777778 | 0 |
| 0.7472222222222222 | 0 |
| 0.7479166666666667 | 0 |
| 0.748611111111111 | 0 |
| 0.7493055555555556 | 0 |
| 0.75 | 0 |
| 0.7506944444444444 | 0 |
| 0.751388888888889 | 0 |
| 0.7520833333333333 | 0 |
| 0.7527777777777778 | 0 |
| 0.7534722222222222 | 0 |
| 0.7541666666666668 | 0 |
| 0.7548611111111111 | 0 |
| 0.7555555555555555 | 0 |
| 0.75625 | 0 |
| 0.7569444444444445 | 0 |
| 0.7576388888888889 | 0 |
| 0.7583333333333333 | 0 |
| 0.7590277777777777 | 0 |
| 0.7597222222222223 | 0 |
| 0.7604166666666666 | 0 |
| 0.7611111111111111 | 0 |
| 0.7618055555555556 | 0 |
| 0.7625000000000001 | 0 |
| 0.7631944444444444 | 0 |
| 0.7638888888888888 | 0 |
| 0.7645833333333334 | 0 |
| 0.7652777777777778 | 0 |
| 0.7659722222222222 | 0 |
| 0.7666666666666666 | 0 |
| 0.7673611111111112 | 0 |
| 0.7680555555555556 | 0 |
| 0.7687499999999999 | 0 |
| 0.7694444444444444 | 0 |
| 0.7701388888888889 | 0 |
| 0.7708333333333334 | 0 |
| 0.7715277777777777 | 0 |
| 0.7722222222222223 | 0 |
| 0.7729166666666667 | 0 |
| 0.7736111111111111 | 0 |
| 0.7743055555555555 | 0 |
| 0.775 | 0 |
| 0.7756944444444445 | 0 |
| 0.7763888888888889 | 0 |
| 0.7770833333333332 | 0 |
| 0.7777777777777778 | 0 |
| 0.7784722222222222 | 0 |
| 0.7791666666666667 | 0 |
| 0.779861111111111 | 0 |
| 0.7805555555555556 | 0 |
| 0.78125 | 0 |
| 0.7819444444444444 | 0 |
| 0.782638888888889 | 0 |
| 0.7833333333333333 | 0 |
| 0.7840277777777778 | 0 |
| 0.7847222222222222 | 0 |
| 0.7854166666666668 | 0 |
| 0.7861111111111111 | 0 |
| 0.7868055555555555 | 0 |
| 0.7875 | 0 |
| 0.7881944444444445 | 0 |
| 0.7888888888888889 | 0 |
| 0.7895833333333333 | 0 |
| 0.7902777777777777 | 0 |
| 0.7909722222222223 | 0 |
| 0.7916666666666666 | 0 |
| 0.7923611111111111 | 0 |
| 0.7930555555555556 | 0 |
| 0.7937500000000001 | 0 |
| 0.7944444444444444 | 0 |
| 0.7951388888888888 | 0 |
| 0.7958333333333334 | 0 |
| 0.7965277777777778 | 0 |
| 0.7972222222222222 | 0 |
| 0.7979166666666666 | 0 |
| 0.7986111111111112 | 0 |
| 0.7993055555555556 | 0 |
| 0.7999999999999999 | 0 |
| 0.8006944444444444 | 0 |
| 0.8013888888888889 | 0 |
| 0.8020833333333334 | 0 |
| 0.8027777777777777 | 0 |
| 0.8034722222222223 | 0 |
| 0.8041666666666667 | 0 |
| 0.8048611111111111 | 0 |
| 0.8055555555555555 | 0 |
| 0.80625 | 0 |
| 0.8069444444444445 | 0 |
| 0.8076388888888889 | 0 |
| 0.8083333333333332 | 0 |
| 0.8090277777777778 | 0 |
| 0.8097222222222222 | 0 |
| 0.8104166666666667 | 0 |
| 0.811111111111111 | 0 |
| 0.8118055555555556 | 0 |
| 0.8125 | 0 |
| 0.8131944444444444 | 0 |
| 0.813888888888889 | 0 |
| 0.8145833333333333 | 0 |
| 0.8152777777777778 | 0 |
| 0.8159722222222222 | 0 |
| 0.8166666666666668 | 0 |
| 0.8173611111111111 | 0 |
| 0.8180555555555555 | 0 |
| 0.81875 | 0 |
| 0.8194444444444445 | 0 |
| 0.8201388888888889 | 0 |
| 0.8208333333333333 | 0 |
| 0.8215277777777777 | 0 |
| 0.8222222222222223 | 0 |
| 0.8229166666666666 | 0 |
| 0.8236111111111111 | 0 |
| 0.8243055555555556 | 0 |
| 0.8250000000000001 | 0 |
| 0.8256944444444444 | 0 |
| 0.8263888888888888 | 0 |
| 0.8270833333333334 | 0 |
| 0.8277777777777778 | 0 |
| 0.8284722222222222 | 0 |
| 0.8291666666666666 | 0 |
| 0.8298611111111112 | 0 |
| 0.8305555555555556 | 0 |
| 0.8312499999999999 | 0 |
| 0.8319444444444444 | 0 |
| 0.8326388888888889 | 0 |
| 0.8333333333333334 | 0 |
| 0.8340277777777777 | 0 |
| 0.8347222222222223 | 0 |
| 0.8354166666666667 | 0 |
| 0.8361111111111111 | 0 |
| 0.8368055555555555 | 0 |
| 0.8375 | 0 |
| 0.8381944444444445 | 0 |
| 0.8388888888888889 | 0 |
| 0.8395833333333332 | 0 |
| 0.8402777777777778 | 0 |
| 0.8409722222222222 | 0 |
| 0.8416666666666667 | 0 |
| 0.842361111111111 | 0 |
| 0.8430555555555556 | 0 |
| 0.84375 | 0 |
| 0.8444444444444444 | 0 |
| 0.845138888888889 | 0 |
| 0.8458333333333333 | 0 |
| 0.8465277777777778 | 0 |
| 0.8472222222222222 | 0 |
| 0.8479166666666668 | 0 |
| 0.8486111111111111 | 0 |
| 0.8493055555555555 | 0 |
| 0.85 | 0 |
| 0.8506944444444445 | 0 |
| 0.8513888888888889 | 0 |
| 0.8520833333333333 | 0 |
| 0.8527777777777777 | 0 |
| 0.8534722222222223 | 0 |
| 0.8541666666666666 | 0 |
| 0.8548611111111111 | 0 |
| 0.8555555555555556 | 0 |
| 0.8562500000000001 | 0 |
| 0.8569444444444444 | 0 |
| 0.8576388888888888 | 0 |
| 0.8583333333333334 | 0 |
| 0.8590277777777778 | 0 |
| 0.8597222222222222 | 0 |
| 0.8604166666666666 | 0 |
| 0.8611111111111112 | 0 |
| 0.8618055555555556 | 0 |
| 0.8624999999999999 | 0 |
| 0.8631944444444444 | 0 |
| 0.8638888888888889 | 0 |
| 0.8645833333333334 | 0 |
| 0.8652777777777777 | 0 |
| 0.8659722222222223 | 0 |
| 0.8666666666666667 | 0 |
| 0.8673611111111111 | 0 |
| 0.8680555555555555 | 0 |
| 0.86875 | 0 |
| 0.8694444444444445 | 0 |
| 0.8701388888888889 | 0 |
| 0.8708333333333332 | 0 |
| 0.8715277777777778 | 0 |
| 0.8722222222222222 | 0 |
| 0.8729166666666667 | 0 |
| 0.873611111111111 | 0 |
| 0.8743055555555556 | 0 |
| 0.875 | 0 |
| 0.8756944444444444 | 0 |
| 0.876388888888889 | 0 |
| 0.8770833333333333 | 0 |
| 0.8777777777777778 | 0 |
| 0.8784722222222222 | 0 |
| 0.8791666666666668 | 0 |
| 0.8798611111111111 | 0 |
| 0.8805555555555555 | 0 |
| 0.88125 | 0 |
| 0.8819444444444445 | 0 |
| 0.8826388888888889 | 0 |
| 0.8833333333333333 | 0 |
| 0.8840277777777777 | 0 |
| 0.8847222222222223 | 0 |
| 0.8854166666666666 | 0 |
| 0.8861111111111111 | 0 |
| 0.8868055555555556 | 0 |
| 0.8875000000000001 | 0 |
| 0.8881944444444444 | 0 |
| 0.8888888888888888 | 0 |
| 0.8895833333333334 | 0 |
| 0.8902777777777778 | 0 |
| 0.8909722222222222 | 0 |
| 0.8916666666666666 | 0 |
| 0.8923611111111112 | 0 |
| 0.8930555555555556 | 0 |
| 0.8937499999999999 | 0 |
| 0.8944444444444444 | 0 |
| 0.8951388888888889 | 0 |
| 0.8958333333333334 | 0 |
| 0.8965277777777777 | 0 |
| 0.8972222222222223 | 0 |
| 0.8979166666666667 | 0 |
| 0.8986111111111111 | 0 |
| 0.8993055555555555 | 0 |
| 0.9 | 0 |
| 0.9006944444444445 | 0 |
| 0.9013888888888889 | 0 |
| 0.9020833333333332 | 0 |
| 0.9027777777777778 | 0 |
| 0.9034722222222222 | 0 |
| 0.9041666666666667 | 0 |
| 0.904861111111111 | 0 |
| 0.9055555555555556 | 0 |
| 0.90625 | 0 |
| 0.9069444444444444 | 0 |
| 0.907638888888889 | 0 |
| 0.9083333333333333 | 0 |
| 0.9090277777777778 | 0 |
| 0.9097222222222222 | 0 |
| 0.9104166666666668 | 0 |
| 0.9111111111111111 | 0 |
| 0.9118055555555555 | 0 |
| 0.9125 | 0 |
| 0.9131944444444445 | 0 |
| 0.9138888888888889 | 0 |
| 0.9145833333333333 | 0 |
| 0.9152777777777777 | 0 |
| 0.9159722222222223 | 0 |
| 0.9166666666666666 | 0 |
| 0.9173611111111111 | 0 |
| 0.9180555555555556 | 0 |
| 0.9187500000000001 | 0 |
| 0.9194444444444444 | 0 |
| 0.9201388888888888 | 0 |
| 0.9208333333333334 | 0 |
| 0.9215277777777778 | 0 |
| 0.9222222222222222 | 0 |
| 0.9229166666666666 | 0 |
| 0.9236111111111112 | 0 |
| 0.9243055555555556 | 0 |
| 0.9249999999999999 | 0 |
| 0.9256944444444444 | 0 |
| 0.9263888888888889 | 0 |
| 0.9270833333333334 | 0 |
| 0.9277777777777777 | 0 |
| 0.9284722222222223 | 0 |
| 0.9291666666666667 | 0 |
| 0.9298611111111111 | 0 |
| 0.9305555555555555 | 0 |
| 0.93125 | 0 |
| 0.9319444444444445 | 0 |
| 0.9326388888888889 | 0 |
| 0.9333333333333332 | 0 |
| 0.9340277777777778 | 0 |
| 0.9347222222222222 | 0 |
| 0.9354166666666667 | 0 |
| 0.936111111111111 | 0 |
| 0.9368055555555556 | 0 |
| 0.9375 | 0 |
| 0.9381944444444444 | 0 |
| 0.938888888888889 | 0 |
| 0.9395833333333333 | 0 |
| 0.9402777777777778 | 0 |
| 0.9409722222222222 | 0 |
| 0.9416666666666668 | 0 |
| 0.9423611111111111 | 0 |
| 0.9430555555555555 | 0 |
| 0.94375 | 0 |
| 0.9444444444444445 | 0 |
| 0.9451388888888889 | 0 |
| 0.9458333333333333 | 0 |
| 0.9465277777777777 | 0 |
| 0.9472222222222223 | 0 |
| 0.9479166666666666 | 0 |
| 0.9486111111111111 | 0 |
| 0.9493055555555556 | 0 |
| 0.9500000000000001 | 0 |
| 0.9506944444444444 | 0 |
| 0.9513888888888888 | 0 |
| 0.9520833333333334 | 0 |
| 0.9527777777777778 | 0 |
| 0.9534722222222222 | 0 |
| 0.9541666666666666 | 0 |
| 0.9548611111111112 | 0 |
| 0.9555555555555556 | 0 |
| 0.9562499999999999 | 0 |
| 0.9569444444444444 | 0 |
| 0.9576388888888889 | 0 |
| 0.9583333333333334 | 0 |
| 0.9590277777777777 | 0 |
| 0.9597222222222223 | 0 |
| 0.9604166666666667 | 0 |
| 0.9611111111111111 | 0 |
| 0.9618055555555555 | 0 |
| 0.9625 | 0 |
| 0.9631944444444445 | 0 |
| 0.9638888888888889 | 0 |
| 0.9645833333333332 | 0 |
| 0.9652777777777778 | 0 |
| 0.9659722222222222 | 0 |
| 0.9666666666666667 | 0 |
| 0.967361111111111 | 0 |
| 0.9680555555555556 | 0 |
| 0.96875 | 0 |
| 0.9694444444444444 | 0 |
| 0.970138888888889 | 0 |
| 0.9708333333333333 | 0 |
| 0.9715277777777778 | 0 |
| 0.9722222222222222 | 0 |
| 0.9729166666666668 | 0 |
| 0.9736111111111111 | 0 |
| 0.9743055555555555 | 0 |
| 0.975 | 0 |
| 0.9756944444444445 | 0 |
| 0.9763888888888889 | 0 |
| 0.9770833333333333 | 0 |
| 0.9777777777777777 | 0 |
| 0.9784722222222223 | 0 |
| 0.9791666666666666 | 0 |
| 0.9798611111111111 | 0 |
| 0.9805555555555556 | 0 |
| 0.9812500000000001 | 0 |
| 0.9819444444444444 | 0 |
| 0.9826388888888888 | 0 |
| 0.9833333333333334 | 0 |
| 0.9840277777777778 | 0 |
| 0.9847222222222222 | 0 |
| 0.9854166666666666 | 0 |
| 0.9861111111111112 | 0 |
| 0.9868055555555556 | 0 |
| 0.9874999999999999 | 0 |
| 0.9881944444444444 | 0 |
| 0.9888888888888889 | 0 |
| 0.9895833333333334 | 0 |
| 0.9902777777777777 | 0 |
| 0.9909722222222223 | 0 |
| 0.9916666666666667 | 0 |
| 0.9923611111111111 | 0 |
| 0.9930555555555555 | 0 |
| 0.99375 | 0 |
| 0.9944444444444445 | 0 |
| 0.9951388888888889 | 0 |
| 0.9958333333333332 | 0 |
| 0.9965277777777778 | 0 |
| 0.9972222222222222 | 0 |
| 0.9979166666666667 | 0 |
| 0.998611111111111 | 0 |
| 0.9993055555555556 | 0 |